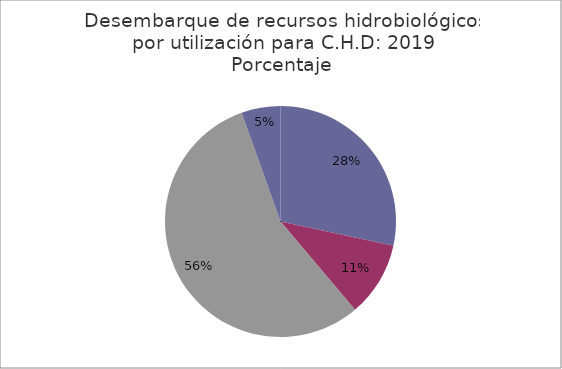
| Category | Series 0 |
|---|---|
| Fresco | 397993.678 |
| Enlatado | 146803.394 |
| Congelado | 781136.5 |
| Curado | 76667.444 |